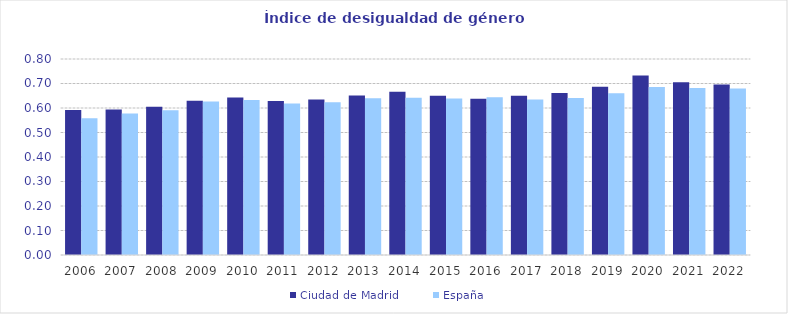
| Category | Ciudad de Madrid | España |
|---|---|---|
| 2006.0 | 0.592 | 0.559 |
| 2007.0 | 0.594 | 0.578 |
| 2008.0 | 0.605 | 0.591 |
| 2009.0 | 0.63 | 0.626 |
| 2010.0 | 0.643 | 0.633 |
| 2011.0 | 0.628 | 0.618 |
| 2012.0 | 0.635 | 0.623 |
| 2013.0 | 0.651 | 0.64 |
| 2014.0 | 0.666 | 0.642 |
| 2015.0 | 0.65 | 0.639 |
| 2016.0 | 0.638 | 0.643 |
| 2017.0 | 0.65 | 0.635 |
| 2018.0 | 0.662 | 0.641 |
| 2019.0 | 0.687 | 0.661 |
| 2020.0 | 0.733 | 0.686 |
| 2021.0 | 0.705 | 0.682 |
| 2022.0 | 0.696 | 0.679 |